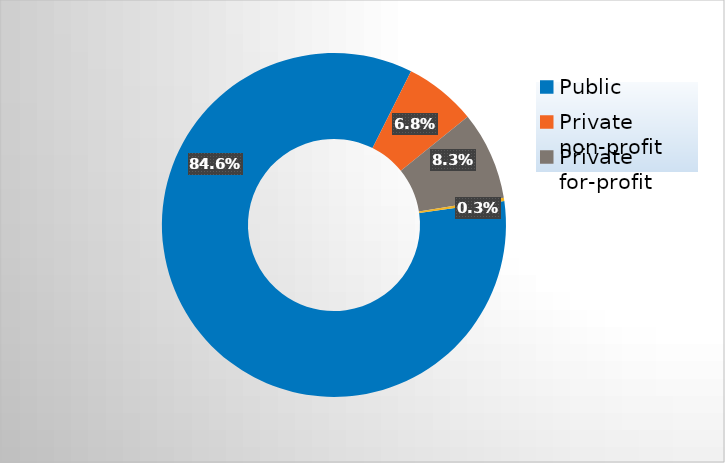
| Category | Series 0 |
|---|---|
| Public | 0.846 |
| Private non-profit | 0.068 |
| Private for-profit | 0.083 |
| Private, state-related | 0.003 |